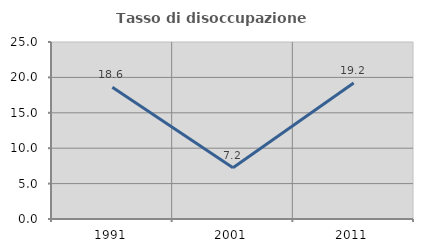
| Category | Tasso di disoccupazione giovanile  |
|---|---|
| 1991.0 | 18.605 |
| 2001.0 | 7.243 |
| 2011.0 | 19.218 |